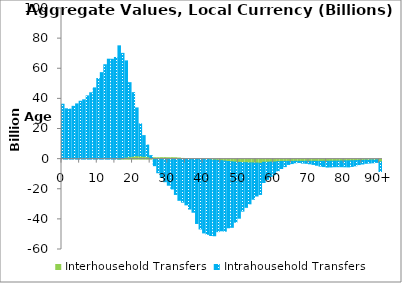
| Category | Interhousehold Transfers | Intrahousehold Transfers |
|---|---|---|
| 0 | 0 | 36451.039 |
|  | 0 | 33412.973 |
| 2 | 0 | 33154.394 |
| 3 | 0 | 35061.608 |
| 4 | 0 | 36668.348 |
| 5 | 0 | 38427.137 |
| 6 | 0 | 39378.187 |
| 7 | 0 | 41990.957 |
| 8 | 0 | 44060.367 |
| 9 | 0 | 47277.034 |
| 10 | 0 | 53507.016 |
| 11 | 0 | 57397.814 |
| 12 | 0 | 62674.616 |
| 13 | 0 | 66345.299 |
| 14 | 0 | 66297.795 |
| 15 | 0 | 67489.994 |
| 16 | 92.172 | 75120.316 |
| 17 | 305.693 | 69910.846 |
| 18 | 1339.329 | 63885.969 |
| 19 | 1604.506 | 49152.413 |
| 20 | 1924.078 | 42204.841 |
| 21 | 2268.17 | 31713.037 |
| 22 | 2039.404 | 21347.871 |
| 23 | 1922.552 | 13687.045 |
| 24 | 1615.934 | 7713.725 |
| 25 | 1091.381 | 1227.976 |
| 26 | 916.991 | -4351.986 |
| 27 | 905.713 | -9050.963 |
| 28 | 964.286 | -12095.942 |
| 29 | 997.199 | -15007.475 |
| 30 | 922.997 | -17324.672 |
| 31 | 958.757 | -19801.491 |
| 32 | 902.247 | -23448.582 |
| 33 | 732.686 | -27347.864 |
| 34 | 462.761 | -28581.88 |
| 35 | 88.94 | -30357.981 |
| 36 | -33.819 | -33109.894 |
| 37 | -44.579 | -35204.577 |
| 38 | -34.706 | -42677.257 |
| 39 | -29.299 | -46344.907 |
| 40 | -120.661 | -48864.166 |
| 41 | -219.946 | -49698.877 |
| 42 | -397.263 | -50317.638 |
| 43 | -638.713 | -50239.28 |
| 44 | -797.533 | -47339.536 |
| 45 | -1021.8 | -46558.311 |
| 46 | -1316.301 | -46514.939 |
| 47 | -1560.815 | -44018.542 |
| 48 | -1818.176 | -43444.304 |
| 49 | -1989.41 | -39874.904 |
| 50 | -2181.807 | -37026.957 |
| 51 | -2265.676 | -32253.241 |
| 52 | -2384.093 | -29619.181 |
| 53 | -2496.675 | -27183.787 |
| 54 | -2533.998 | -24093.87 |
| 55 | -2609.47 | -21873.209 |
| 56 | -2796.386 | -20646.523 |
| 57 | -2082.593 | -13443.619 |
| 58 | -2050.446 | -11410.959 |
| 59 | -1940.362 | -9615.307 |
| 60 | -1918.982 | -8357.765 |
| 61 | -1667.195 | -6102.56 |
| 62 | -1552.585 | -4675.897 |
| 63 | -1522.013 | -3463.408 |
| 64 | -1485.316 | -2040.995 |
| 65 | -1509.316 | -1446.91 |
| 66 | -1449.804 | -985.82 |
| 67 | -1449.497 | -772.231 |
| 68 | -1498.316 | -1123.33 |
| 69 | -1410.599 | -1372.972 |
| 70 | -1417.865 | -1682.57 |
| 71 | -1437.6 | -2078.078 |
| 72 | -1458.706 | -2595.375 |
| 73 | -1486.354 | -3159.571 |
| 74 | -1409.779 | -3541.631 |
| 75 | -1409.467 | -3864.266 |
| 76 | -1370.165 | -3838.497 |
| 77 | -1314.042 | -3747.36 |
| 78 | -1297.14 | -3743.795 |
| 79 | -1229.226 | -3813.003 |
| 80 | -1166.181 | -3937.75 |
| 81 | -1128.655 | -4034.7 |
| 82 | -1060.568 | -3787.096 |
| 83 | -1004.569 | -3428.098 |
| 84 | -862.223 | -2751.843 |
| 85 | -814.381 | -2412.057 |
| 86 | -705.003 | -2058.656 |
| 87 | -629.247 | -1959.575 |
| 88 | -564.531 | -1870.779 |
| 89 | -485.402 | -1681.586 |
| 90+ | -1852.44 | -6375.59 |